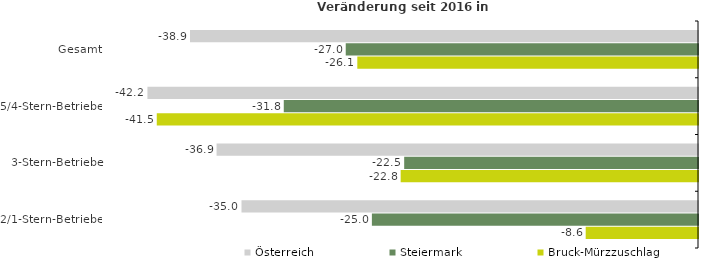
| Category | Österreich | Steiermark | Bruck-Mürzzuschlag |
|---|---|---|---|
| Gesamt | -38.943 | -27.005 | -26.118 |
| 5/4-Stern-Betriebe | -42.206 | -31.755 | -41.491 |
| 3-Stern-Betriebe | -36.907 | -22.524 | -22.793 |
| 2/1-Stern-Betriebe | -34.996 | -25 | -8.609 |